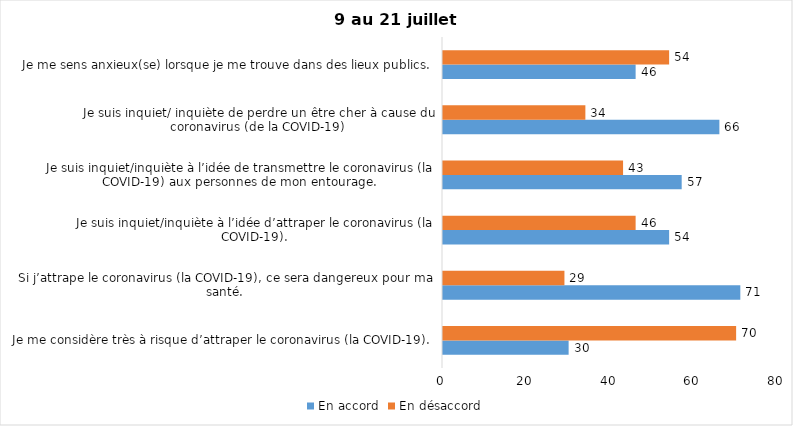
| Category | En accord | En désaccord |
|---|---|---|
| Je me considère très à risque d’attraper le coronavirus (la COVID-19). | 30 | 70 |
| Si j’attrape le coronavirus (la COVID-19), ce sera dangereux pour ma santé. | 71 | 29 |
| Je suis inquiet/inquiète à l’idée d’attraper le coronavirus (la COVID-19). | 54 | 46 |
| Je suis inquiet/inquiète à l’idée de transmettre le coronavirus (la COVID-19) aux personnes de mon entourage. | 57 | 43 |
| Je suis inquiet/ inquiète de perdre un être cher à cause du coronavirus (de la COVID-19) | 66 | 34 |
| Je me sens anxieux(se) lorsque je me trouve dans des lieux publics. | 46 | 54 |